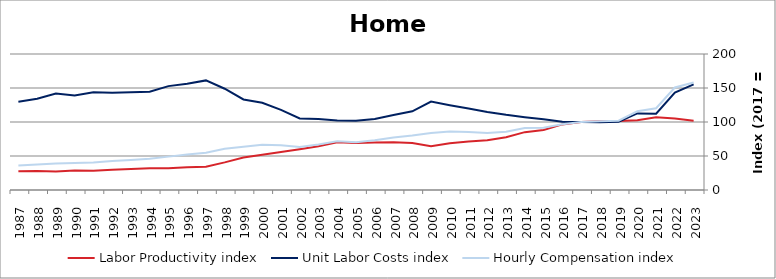
| Category | Labor Productivity index | Unit Labor Costs index | Hourly Compensation index |
|---|---|---|---|
| 2023.0 | 101.746 | 155.323 | 158.035 |
| 2022.0 | 105.096 | 143.435 | 150.744 |
| 2021.0 | 107.147 | 112.161 | 120.177 |
| 2020.0 | 102.734 | 112.668 | 115.749 |
| 2019.0 | 101.527 | 100.401 | 101.934 |
| 2018.0 | 101.189 | 99.765 | 100.951 |
| 2017.0 | 100 | 100 | 100 |
| 2016.0 | 96.493 | 100.309 | 96.791 |
| 2015.0 | 88.125 | 104.057 | 91.7 |
| 2014.0 | 85.09 | 107.014 | 91.059 |
| 2013.0 | 77.585 | 110.585 | 85.798 |
| 2012.0 | 73.069 | 114.856 | 83.924 |
| 2011.0 | 71.233 | 119.814 | 85.348 |
| 2010.0 | 68.909 | 124.767 | 85.975 |
| 2009.0 | 64.324 | 130.133 | 83.706 |
| 2008.0 | 69.228 | 115.676 | 80.081 |
| 2007.0 | 70.194 | 110.141 | 77.312 |
| 2006.0 | 69.937 | 104.408 | 73.02 |
| 2005.0 | 69.07 | 101.685 | 70.234 |
| 2004.0 | 70.046 | 102.327 | 71.676 |
| 2003.0 | 64.206 | 104.338 | 66.991 |
| 2002.0 | 60.022 | 105.152 | 63.114 |
| 2001.0 | 55.878 | 117.91 | 65.886 |
| 2000.0 | 51.757 | 128.396 | 66.454 |
| 1999.0 | 47.859 | 133.206 | 63.751 |
| 1998.0 | 40.629 | 148.919 | 60.505 |
| 1997.0 | 34.094 | 161.157 | 54.946 |
| 1996.0 | 33.373 | 156.091 | 52.092 |
| 1995.0 | 32.13 | 152.767 | 49.084 |
| 1994.0 | 31.834 | 144.429 | 45.978 |
| 1993.0 | 30.753 | 143.621 | 44.168 |
| 1992.0 | 29.843 | 143.15 | 42.72 |
| 1991.0 | 28.232 | 143.806 | 40.599 |
| 1990.0 | 28.634 | 139.143 | 39.842 |
| 1989.0 | 27.342 | 141.962 | 38.815 |
| 1988.0 | 27.911 | 134.088 | 37.425 |
| 1987.0 | 27.649 | 129.893 | 35.914 |